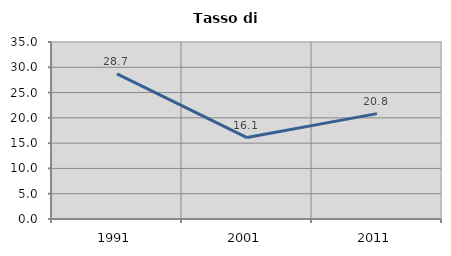
| Category | Tasso di disoccupazione   |
|---|---|
| 1991.0 | 28.688 |
| 2001.0 | 16.104 |
| 2011.0 | 20.832 |